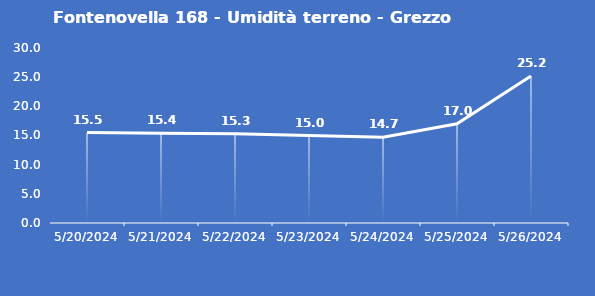
| Category | Fontenovella 168 - Umidità terreno - Grezzo (%VWC) |
|---|---|
| 5/20/24 | 15.5 |
| 5/21/24 | 15.4 |
| 5/22/24 | 15.3 |
| 5/23/24 | 15 |
| 5/24/24 | 14.7 |
| 5/25/24 | 17 |
| 5/26/24 | 25.2 |